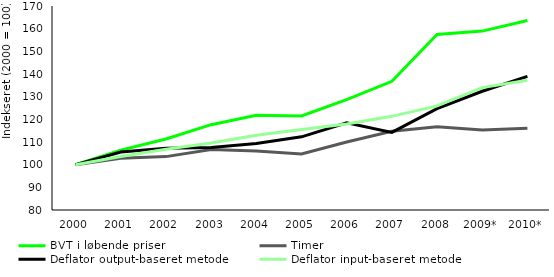
| Category | BVT i løbende priser | Timer | Deflator output-baseret metode | Deflator input-baseret metode |
|---|---|---|---|---|
| 2000 | 100 | 100 | 100 | 100 |
| 2001 | 106.426 | 102.85 | 105.596 | 103.6 |
| 2002 | 111.314 | 103.549 | 107.28 | 106.812 |
| 2003 | 117.636 | 106.687 | 107.613 | 109.589 |
| 2004 | 121.798 | 106.057 | 109.31 | 112.986 |
| 2005 | 121.51 | 104.684 | 112.289 | 115.472 |
| 2006 | 128.682 | 110.017 | 118.427 | 117.897 |
| 2007 | 136.79 | 114.777 | 114.227 | 121.316 |
| 2008 | 157.403 | 116.718 | 124.747 | 125.926 |
| 2009* | 158.932 | 115.349 | 132.383 | 133.985 |
| 2010* | 163.636 | 116.082 | 138.92 | 137.2 |